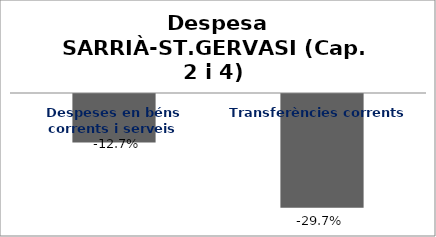
| Category | Series 0 |
|---|---|
| Despeses en béns corrents i serveis | -0.127 |
| Transferències corrents | -0.297 |